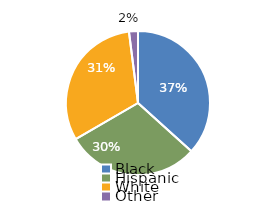
| Category | Series 0 |
|---|---|
| Black | 0.365 |
| Hispanic | 0.298 |
| White  | 0.312 |
| Other | 0.02 |